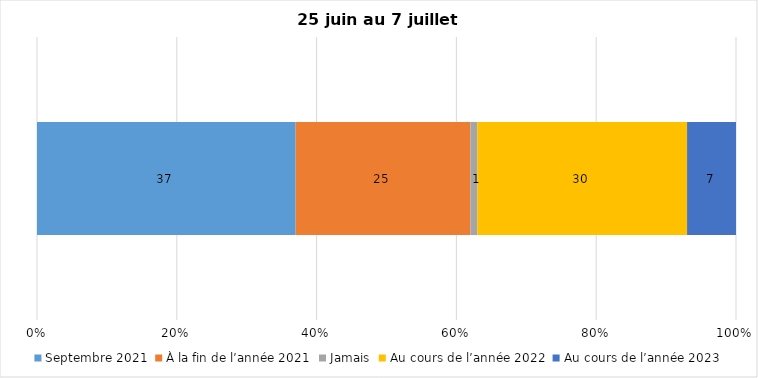
| Category | Septembre 2021 | À la fin de l’année 2021 | Jamais | Au cours de l’année 2022 | Au cours de l’année 2023 |
|---|---|---|---|---|---|
| 0 | 37 | 25 | 1 | 30 | 7 |